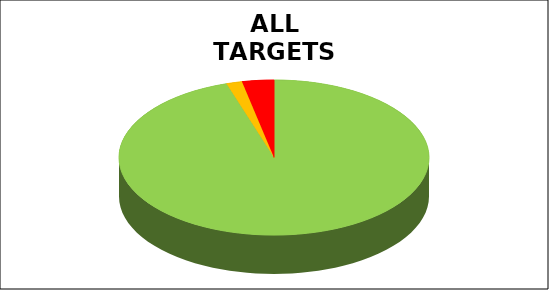
| Category | Series 0 |
|---|---|
| Green | 0.95 |
| Amber | 0.017 |
| Red | 0.033 |